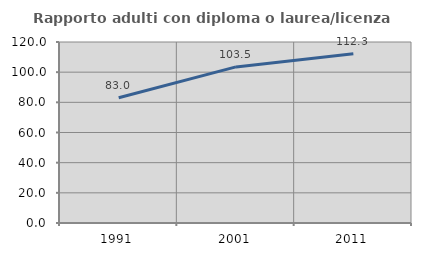
| Category | Rapporto adulti con diploma o laurea/licenza media  |
|---|---|
| 1991.0 | 83.049 |
| 2001.0 | 103.485 |
| 2011.0 | 112.285 |